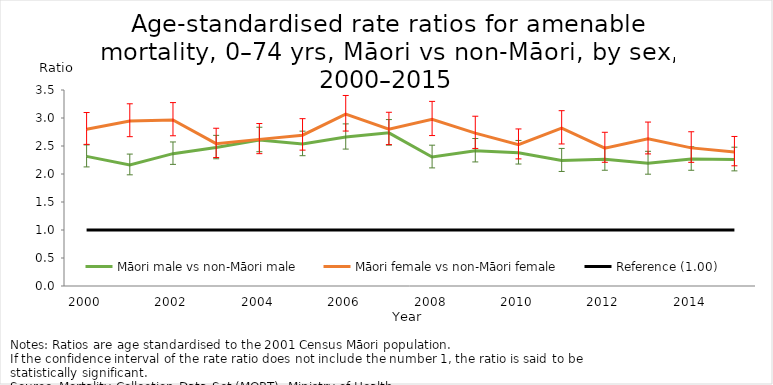
| Category | Māori male vs non-Māori male | Māori female vs non-Māori female | Reference (1.00) |
|---|---|---|---|
| 2000.0 | 2.315 | 2.799 | 1 |
| 2001.0 | 2.163 | 2.945 | 1 |
| 2002.0 | 2.363 | 2.964 | 1 |
| 2003.0 | 2.472 | 2.542 | 1 |
| 2004.0 | 2.607 | 2.618 | 1 |
| 2005.0 | 2.537 | 2.692 | 1 |
| 2006.0 | 2.66 | 3.068 | 1 |
| 2007.0 | 2.734 | 2.799 | 1 |
| 2008.0 | 2.303 | 2.976 | 1 |
| 2009.0 | 2.416 | 2.729 | 1 |
| 2010.0 | 2.379 | 2.523 | 1 |
| 2011.0 | 2.242 | 2.818 | 1 |
| 2012.0 | 2.264 | 2.462 | 1 |
| 2013.0 | 2.191 | 2.628 | 1 |
| 2014.0 | 2.267 | 2.466 | 1 |
| 2015.0 | 2.257 | 2.394 | 1 |